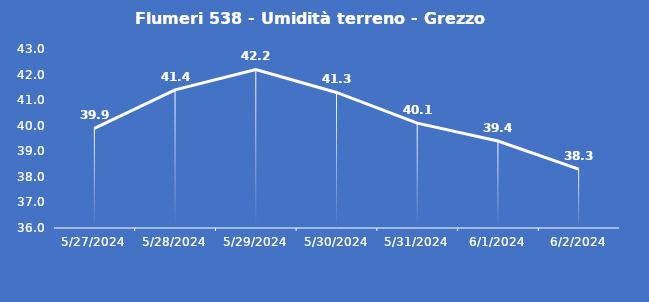
| Category | Flumeri 538 - Umidità terreno - Grezzo (%VWC) |
|---|---|
| 5/27/24 | 39.9 |
| 5/28/24 | 41.4 |
| 5/29/24 | 42.2 |
| 5/30/24 | 41.3 |
| 5/31/24 | 40.1 |
| 6/1/24 | 39.4 |
| 6/2/24 | 38.3 |